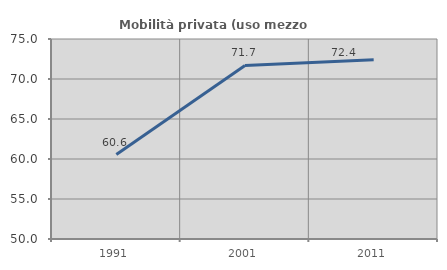
| Category | Mobilità privata (uso mezzo privato) |
|---|---|
| 1991.0 | 60.55 |
| 2001.0 | 71.688 |
| 2011.0 | 72.393 |